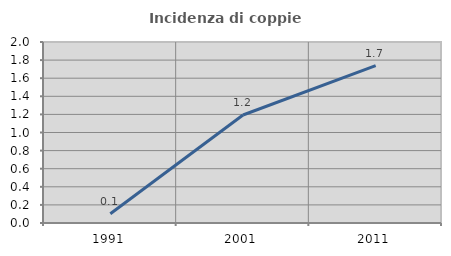
| Category | Incidenza di coppie miste |
|---|---|
| 1991.0 | 0.102 |
| 2001.0 | 1.193 |
| 2011.0 | 1.739 |